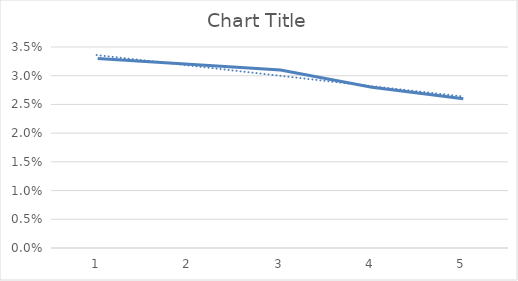
| Category | Series 0 |
|---|---|
| 0 | 0.033 |
| 1 | 0.032 |
| 2 | 0.031 |
| 3 | 0.028 |
| 4 | 0.026 |